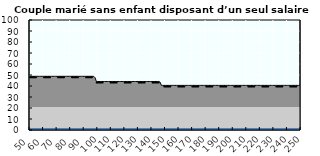
| Category | Coin fiscal marginal (somme des composantes) | Taux d’imposition marginal net |
|---|---|---|
| 50.0 | 48.816 | 47.9 |
| 51.0 | 48.816 | 47.9 |
| 52.0 | 48.816 | 47.9 |
| 53.0 | 48.816 | 47.9 |
| 54.0 | 48.816 | 47.9 |
| 55.0 | 48.816 | 47.9 |
| 56.0 | 48.816 | 47.9 |
| 57.0 | 48.816 | 47.9 |
| 58.0 | 48.816 | 47.9 |
| 59.0 | 48.816 | 47.9 |
| 60.0 | 48.816 | 47.9 |
| 61.0 | 48.816 | 47.9 |
| 62.0 | 48.816 | 47.9 |
| 63.0 | 48.816 | 47.9 |
| 64.0 | 48.816 | 47.9 |
| 65.0 | 48.816 | 47.9 |
| 66.0 | 48.816 | 47.9 |
| 67.0 | 48.816 | 47.9 |
| 68.0 | 48.816 | 47.9 |
| 69.0 | 48.816 | 47.9 |
| 70.0 | 48.816 | 47.9 |
| 71.0 | 48.816 | 47.9 |
| 72.0 | 48.816 | 47.9 |
| 73.0 | 48.816 | 47.9 |
| 74.0 | 48.816 | 47.9 |
| 75.0 | 48.816 | 47.9 |
| 76.0 | 48.816 | 47.9 |
| 77.0 | 48.816 | 47.9 |
| 78.0 | 48.816 | 47.9 |
| 79.0 | 48.816 | 47.9 |
| 80.0 | 48.816 | 47.9 |
| 81.0 | 48.816 | 47.9 |
| 82.0 | 48.816 | 47.9 |
| 83.0 | 48.816 | 47.9 |
| 84.0 | 48.816 | 47.9 |
| 85.0 | 48.816 | 47.9 |
| 86.0 | 48.816 | 47.9 |
| 87.0 | 48.816 | 47.9 |
| 88.0 | 48.816 | 47.9 |
| 89.0 | 48.816 | 47.9 |
| 90.0 | 48.816 | 47.9 |
| 91.0 | 48.816 | 47.9 |
| 92.0 | 48.816 | 47.9 |
| 93.0 | 48.816 | 47.9 |
| 94.0 | 48.816 | 47.9 |
| 95.0 | 48.816 | 47.9 |
| 96.0 | 48.816 | 47.9 |
| 97.0 | 48.816 | 47.9 |
| 98.0 | 47.543 | 46.605 |
| 99.0 | 44.101 | 43.1 |
| 100.0 | 44.101 | 43.1 |
| 101.0 | 44.101 | 43.1 |
| 102.0 | 44.101 | 43.1 |
| 103.0 | 44.101 | 43.1 |
| 104.0 | 44.101 | 43.1 |
| 105.0 | 44.101 | 43.1 |
| 106.0 | 44.101 | 43.1 |
| 107.0 | 44.101 | 43.1 |
| 108.0 | 44.101 | 43.1 |
| 109.0 | 44.101 | 43.1 |
| 110.0 | 44.101 | 43.1 |
| 111.0 | 44.101 | 43.1 |
| 112.0 | 44.101 | 43.1 |
| 113.0 | 44.101 | 43.1 |
| 114.0 | 44.101 | 43.1 |
| 115.0 | 44.101 | 43.1 |
| 116.0 | 44.101 | 43.1 |
| 117.0 | 44.101 | 43.1 |
| 118.0 | 44.101 | 43.1 |
| 119.0 | 44.101 | 43.1 |
| 120.0 | 44.101 | 43.1 |
| 121.0 | 44.101 | 43.1 |
| 122.0 | 44.101 | 43.1 |
| 123.0 | 44.101 | 43.1 |
| 124.0 | 44.101 | 43.1 |
| 125.0 | 44.101 | 43.1 |
| 126.0 | 44.101 | 43.1 |
| 127.0 | 44.101 | 43.1 |
| 128.0 | 44.101 | 43.1 |
| 129.0 | 44.101 | 43.1 |
| 130.0 | 44.101 | 43.1 |
| 131.0 | 44.101 | 43.1 |
| 132.0 | 44.101 | 43.1 |
| 133.0 | 44.101 | 43.1 |
| 134.0 | 44.101 | 43.1 |
| 135.0 | 44.101 | 43.1 |
| 136.0 | 44.101 | 43.1 |
| 137.0 | 44.101 | 43.1 |
| 138.0 | 44.101 | 43.1 |
| 139.0 | 44.101 | 43.1 |
| 140.0 | 44.101 | 43.1 |
| 141.0 | 44.101 | 43.1 |
| 142.0 | 44.101 | 43.1 |
| 143.0 | 44.101 | 43.1 |
| 144.0 | 44.101 | 43.1 |
| 145.0 | 44.101 | 43.1 |
| 146.0 | 43.482 | 42.47 |
| 147.0 | 40.564 | 39.5 |
| 148.0 | 40.564 | 39.5 |
| 149.0 | 40.564 | 39.5 |
| 150.0 | 40.564 | 39.5 |
| 151.0 | 40.564 | 39.5 |
| 152.0 | 40.564 | 39.5 |
| 153.0 | 40.564 | 39.5 |
| 154.0 | 40.564 | 39.5 |
| 155.0 | 40.564 | 39.5 |
| 156.0 | 40.564 | 39.5 |
| 157.0 | 40.564 | 39.5 |
| 158.0 | 40.564 | 39.5 |
| 159.0 | 40.564 | 39.5 |
| 160.0 | 40.564 | 39.5 |
| 161.0 | 40.564 | 39.5 |
| 162.0 | 40.564 | 39.5 |
| 163.0 | 40.564 | 39.5 |
| 164.0 | 40.564 | 39.5 |
| 165.0 | 40.564 | 39.5 |
| 166.0 | 40.564 | 39.5 |
| 167.0 | 40.564 | 39.5 |
| 168.0 | 40.564 | 39.5 |
| 169.0 | 40.564 | 39.5 |
| 170.0 | 40.564 | 39.5 |
| 171.0 | 40.564 | 39.5 |
| 172.0 | 40.564 | 39.5 |
| 173.0 | 40.564 | 39.5 |
| 174.0 | 40.564 | 39.5 |
| 175.0 | 40.564 | 39.5 |
| 176.0 | 40.564 | 39.5 |
| 177.0 | 40.564 | 39.5 |
| 178.0 | 40.564 | 39.5 |
| 179.0 | 40.564 | 39.5 |
| 180.0 | 40.564 | 39.5 |
| 181.0 | 40.564 | 39.5 |
| 182.0 | 40.564 | 39.5 |
| 183.0 | 40.564 | 39.5 |
| 184.0 | 40.564 | 39.5 |
| 185.0 | 40.564 | 39.5 |
| 186.0 | 40.564 | 39.5 |
| 187.0 | 40.564 | 39.5 |
| 188.0 | 40.564 | 39.5 |
| 189.0 | 40.564 | 39.5 |
| 190.0 | 40.564 | 39.5 |
| 191.0 | 40.564 | 39.5 |
| 192.0 | 40.564 | 39.5 |
| 193.0 | 40.564 | 39.5 |
| 194.0 | 40.564 | 39.5 |
| 195.0 | 40.564 | 39.5 |
| 196.0 | 40.564 | 39.5 |
| 197.0 | 40.564 | 39.5 |
| 198.0 | 40.564 | 39.5 |
| 199.0 | 40.564 | 39.5 |
| 200.0 | 40.564 | 39.5 |
| 201.0 | 40.564 | 39.5 |
| 202.0 | 40.564 | 39.5 |
| 203.0 | 40.564 | 39.5 |
| 204.0 | 40.564 | 39.5 |
| 205.0 | 40.564 | 39.5 |
| 206.0 | 40.564 | 39.5 |
| 207.0 | 40.564 | 39.5 |
| 208.0 | 40.564 | 39.5 |
| 209.0 | 40.564 | 39.5 |
| 210.0 | 40.564 | 39.5 |
| 211.0 | 40.564 | 39.5 |
| 212.0 | 40.564 | 39.5 |
| 213.0 | 40.564 | 39.5 |
| 214.0 | 40.564 | 39.5 |
| 215.0 | 40.564 | 39.5 |
| 216.0 | 40.564 | 39.5 |
| 217.0 | 40.564 | 39.5 |
| 218.0 | 40.564 | 39.5 |
| 219.0 | 40.564 | 39.5 |
| 220.0 | 40.564 | 39.5 |
| 221.0 | 40.564 | 39.5 |
| 222.0 | 40.564 | 39.5 |
| 223.0 | 40.564 | 39.5 |
| 224.0 | 40.564 | 39.5 |
| 225.0 | 40.564 | 39.5 |
| 226.0 | 40.564 | 39.5 |
| 227.0 | 40.564 | 39.5 |
| 228.0 | 40.564 | 39.5 |
| 229.0 | 40.564 | 39.5 |
| 230.0 | 40.564 | 39.5 |
| 231.0 | 40.564 | 39.5 |
| 232.0 | 40.564 | 39.5 |
| 233.0 | 40.564 | 39.5 |
| 234.0 | 40.564 | 39.5 |
| 235.0 | 40.564 | 39.5 |
| 236.0 | 40.564 | 39.5 |
| 237.0 | 40.564 | 39.5 |
| 238.0 | 40.564 | 39.5 |
| 239.0 | 40.564 | 39.5 |
| 240.0 | 40.564 | 39.5 |
| 241.0 | 40.564 | 39.5 |
| 242.0 | 40.564 | 39.5 |
| 243.0 | 40.564 | 39.5 |
| 244.0 | 40.564 | 39.5 |
| 245.0 | 40.564 | 39.5 |
| 246.0 | 40.564 | 39.5 |
| 247.0 | 40.564 | 39.5 |
| 248.0 | 40.564 | 39.5 |
| 249.0 | 40.564 | 39.5 |
| 250.0 | 40.564 | 39.5 |